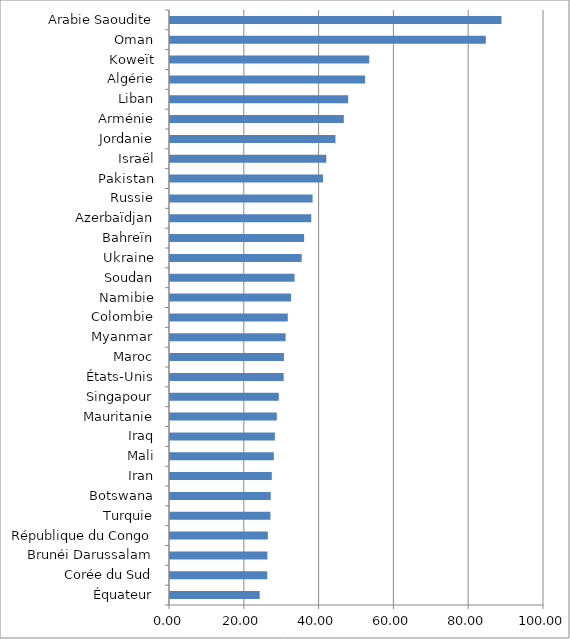
| Category | Series 0 |
|---|---|
| Équateur | 23.982 |
| Corée du Sud | 25.998 |
| Brunéi Darussalam | 26.041 |
| République du Congo | 26.16 |
| Turquie | 26.856 |
| Botswana | 26.92 |
| Iran | 27.223 |
| Mali | 27.758 |
| Iraq | 28.048 |
| Mauritanie | 28.551 |
| Singapour | 29.079 |
| États-Unis | 30.396 |
| Maroc | 30.466 |
| Myanmar | 30.914 |
| Colombie | 31.5 |
| Namibie | 32.376 |
| Soudan | 33.304 |
| Ukraine | 35.215 |
| Bahreïn | 35.865 |
| Azerbaïdjan | 37.77 |
| Russie | 38.12 |
| Pakistan | 40.918 |
| Israël | 41.793 |
| Jordanie | 44.243 |
| Arménie | 46.471 |
| Liban | 47.631 |
| Algérie | 52.176 |
| Koweït | 53.279 |
| Oman | 84.447 |
| Arabie Saoudite | 88.625 |